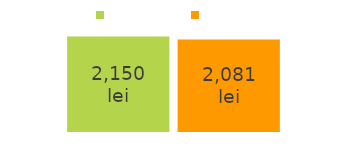
| Category | intrări | ieșiri |
|---|---|---|
| bani intrați: | 2150 | 2081 |